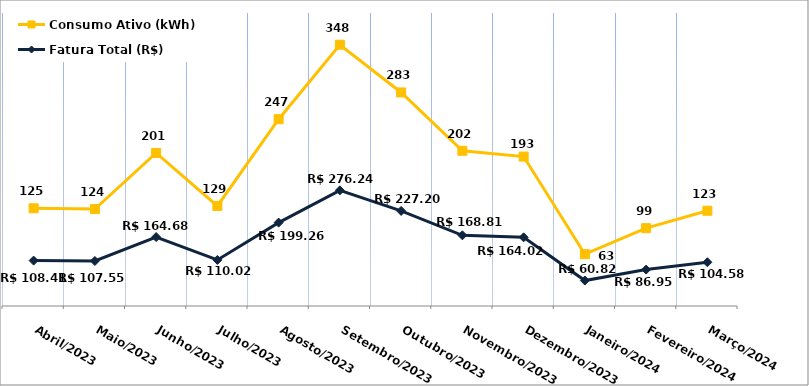
| Category | Fatura Total (R$) | Consumo Ativo (kWh) |
|---|---|---|
| Abril/2023 | 108.41 | 125 |
| Maio/2023 | 107.55 | 124 |
| Junho/2023 | 164.68 | 201 |
| Julho/2023 | 110.02 | 129 |
| Agosto/2023 | 199.26 | 247 |
| Setembro/2023 | 276.24 | 348 |
| Outubro/2023 | 227.2 | 283 |
| Novembro/2023 | 168.81 | 202 |
| Dezembro/2023 | 164.02 | 193 |
| Janeiro/2024 | 60.82 | 63 |
| Fevereiro/2024 | 86.95 | 99 |
| Março/2024 | 104.58 | 123 |